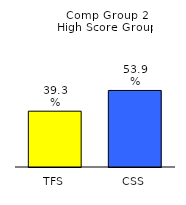
| Category | Series 0 |
|---|---|
| TFS | 0.393 |
| CSS | 0.539 |